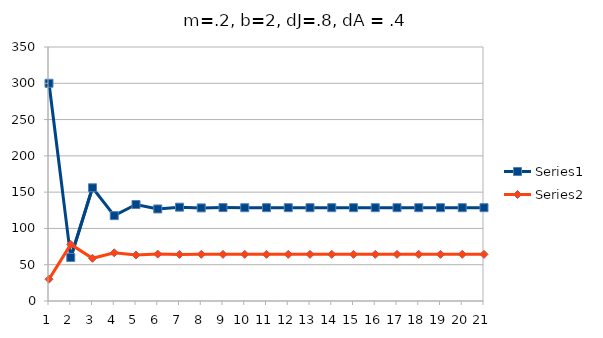
| Category | Series 0 | Series 1 |
|---|---|---|
| 0 | 300 | 30 |
| 1 | 60 | 78 |
| 2 | 156 | 58.8 |
| 3 | 117.6 | 66.48 |
| 4 | 132.96 | 63.408 |
| 5 | 126.816 | 64.637 |
| 6 | 129.274 | 64.145 |
| 7 | 128.291 | 64.342 |
| 8 | 128.684 | 64.263 |
| 9 | 128.526 | 64.295 |
| 10 | 128.589 | 64.282 |
| 11 | 128.564 | 64.287 |
| 12 | 128.574 | 64.285 |
| 13 | 128.57 | 64.286 |
| 14 | 128.572 | 64.286 |
| 15 | 128.571 | 64.286 |
| 16 | 128.572 | 64.286 |
| 17 | 128.571 | 64.286 |
| 18 | 128.571 | 64.286 |
| 19 | 128.571 | 64.286 |
| 20 | 128.571 | 64.286 |